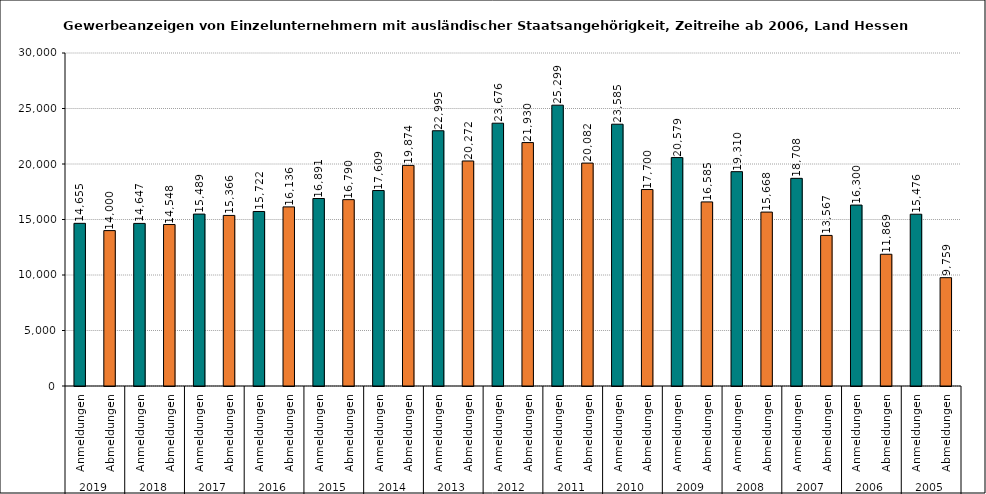
| Category | Series 0 |
|---|---|
| 0 | 14655 |
| 1 | 14000 |
| 2 | 14647 |
| 3 | 14548 |
| 4 | 15489 |
| 5 | 15366 |
| 6 | 15722 |
| 7 | 16136 |
| 8 | 16891 |
| 9 | 16790 |
| 10 | 17609 |
| 11 | 19874 |
| 12 | 22995 |
| 13 | 20272 |
| 14 | 23676 |
| 15 | 21930 |
| 16 | 25299 |
| 17 | 20082 |
| 18 | 23585 |
| 19 | 17700 |
| 20 | 20579 |
| 21 | 16585 |
| 22 | 19310 |
| 23 | 15668 |
| 24 | 18708 |
| 25 | 13567 |
| 26 | 16300 |
| 27 | 11869 |
| 28 | 15476 |
| 29 | 9759 |